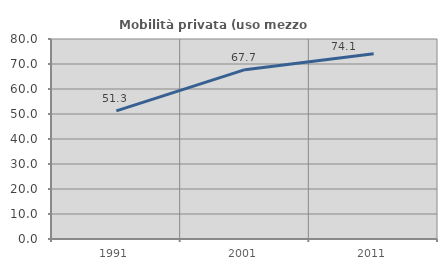
| Category | Mobilità privata (uso mezzo privato) |
|---|---|
| 1991.0 | 51.252 |
| 2001.0 | 67.735 |
| 2011.0 | 74.09 |